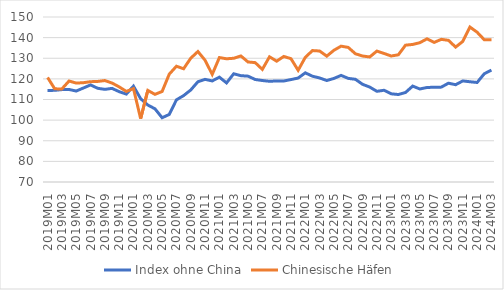
| Category | Index ohne China | Chinesische Häfen |
|---|---|---|
| 2019M01 | 114.355 | 120.692 |
| 2019M02 | 114.449 | 115.16 |
| 2019M03 | 114.796 | 115.13 |
| 2019M04 | 114.865 | 118.972 |
| 2019M05 | 114.104 | 117.96 |
| 2019M06 | 115.57 | 118.153 |
| 2019M07 | 117.066 | 118.633 |
| 2019M08 | 115.437 | 118.763 |
| 2019M09 | 114.916 | 119.19 |
| 2019M10 | 115.394 | 117.984 |
| 2019M11 | 113.809 | 116.117 |
| 2019M12 | 112.632 | 113.941 |
| 2020M01 | 116.473 | 115.279 |
| 2020M02 | 110.396 | 100.724 |
| 2020M03 | 107.326 | 114.409 |
| 2020M04 | 105.49 | 112.491 |
| 2020M05 | 101.164 | 113.891 |
| 2020M06 | 102.753 | 122.3 |
| 2020M07 | 109.836 | 126.131 |
| 2020M08 | 111.881 | 124.909 |
| 2020M09 | 114.622 | 130.022 |
| 2020M10 | 118.616 | 133.267 |
| 2020M11 | 119.77 | 129.023 |
| 2020M12 | 119.004 | 122.178 |
| 2021M01 | 120.83 | 130.335 |
| 2021M02 | 118.047 | 129.747 |
| 2021M03 | 122.471 | 129.991 |
| 2021M04 | 121.549 | 131.107 |
| 2021M05 | 121.321 | 128.196 |
| 2021M06 | 119.706 | 127.879 |
| 2021M07 | 119.205 | 124.61 |
| 2021M08 | 118.826 | 130.693 |
| 2021M09 | 118.993 | 128.592 |
| 2021M10 | 118.986 | 130.866 |
| 2021M11 | 119.663 | 129.791 |
| 2021M12 | 120.405 | 124.168 |
| 2022M01 | 122.918 | 130.426 |
| 2022M02 | 121.295 | 133.724 |
| 2022M03 | 120.444 | 133.512 |
| 2022M04 | 119.201 | 131.022 |
| 2022M05 | 120.219 | 133.875 |
| 2022M06 | 121.684 | 135.857 |
| 2022M07 | 120.241 | 135.251 |
| 2022M08 | 119.796 | 132.178 |
| 2022M09 | 117.368 | 131.086 |
| 2022M10 | 116.022 | 130.625 |
| 2022M11 | 113.971 | 133.484 |
| 2022M12 | 114.48 | 132.329 |
| 2023M01 | 112.756 | 131.086 |
| 2023M02 | 112.414 | 131.666 |
| 2023M03 | 113.397 | 136.34 |
| 2023M04 | 116.494 | 136.692 |
| 2023M05 | 115.102 | 137.542 |
| 2023M06 | 115.827 | 139.418 |
| 2023M07 | 115.937 | 137.678 |
| 2023M08 | 116.002 | 139.168 |
| 2023M09 | 117.907 | 138.685 |
| 2023M10 | 117.17 | 135.404 |
| 2023M11 | 119.004 | 138.171 |
| 2023M12 | 118.606 | 145.133 |
| 2024M01 | 118.247 | 142.633 |
| 2024M02 | 122.474 | 138.975 |
| 2024M03 | 124.282 | 138.949 |